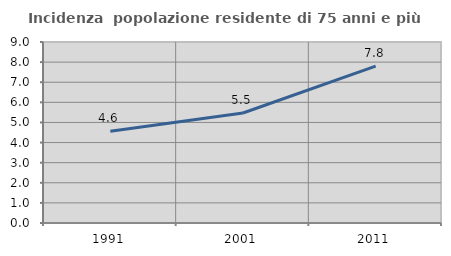
| Category | Incidenza  popolazione residente di 75 anni e più |
|---|---|
| 1991.0 | 4.558 |
| 2001.0 | 5.469 |
| 2011.0 | 7.802 |